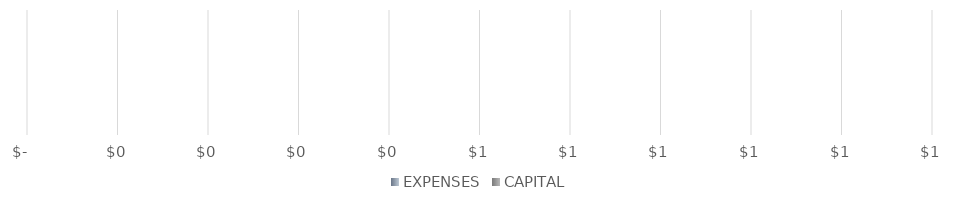
| Category | EXPENSES | CAPITAL |
|---|---|---|
| 0 | 0 | 0 |